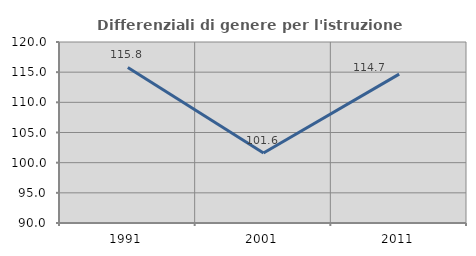
| Category | Differenziali di genere per l'istruzione superiore |
|---|---|
| 1991.0 | 115.779 |
| 2001.0 | 101.597 |
| 2011.0 | 114.67 |